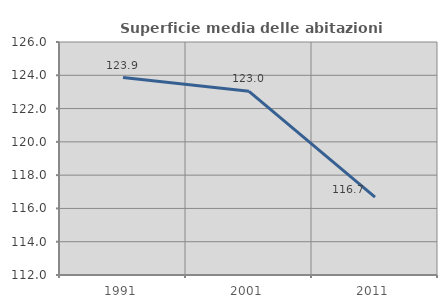
| Category | Superficie media delle abitazioni occupate |
|---|---|
| 1991.0 | 123.867 |
| 2001.0 | 123.036 |
| 2011.0 | 116.677 |